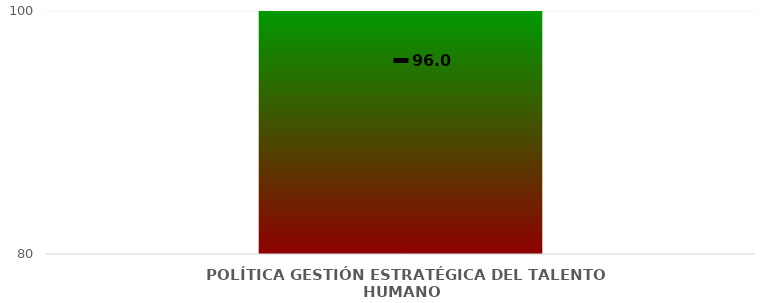
| Category | Niveles |
|---|---|
| POLÍTICA GESTIÓN ESTRATÉGICA DEL TALENTO HUMANO | 100 |